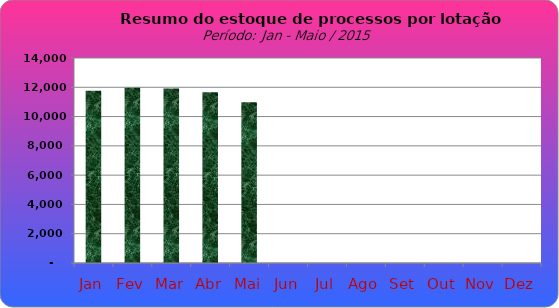
| Category | Series 0 |
|---|---|
| Jan | 11768 |
| Fev | 11973 |
| Mar | 11918 |
| Abr | 11669 |
| Mai | 10977 |
| Jun | 0 |
| Jul | 0 |
| Ago | 0 |
| Set | 0 |
| Out | 0 |
| Nov | 0 |
| Dez | 0 |